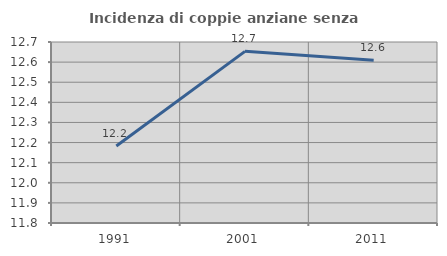
| Category | Incidenza di coppie anziane senza figli  |
|---|---|
| 1991.0 | 12.183 |
| 2001.0 | 12.653 |
| 2011.0 | 12.609 |